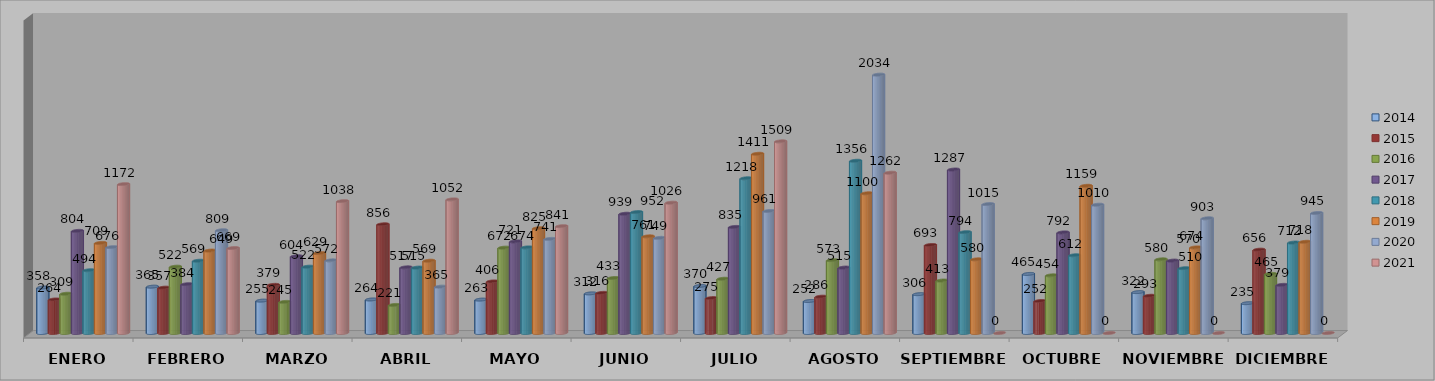
| Category | 2014 | 2015 | 2016 | 2017 | 2018 | 2019 | 2020 | 2021 |
|---|---|---|---|---|---|---|---|---|
| ENERO | 358 | 264 | 309 | 804 | 494 | 709 | 676 | 1172 |
| FEBRERO | 365 | 357 | 522 | 384 | 569 | 649 | 809 | 669 |
| MARZO | 255 | 379 | 245 | 604 | 522 | 629 | 572 | 1038 |
| ABRIL | 264 | 856 | 221 | 517 | 515 | 569 | 365 | 1052 |
| MAYO | 263 | 406 | 672 | 721 | 674 | 825 | 741 | 841 |
| JUNIO | 312 | 316 | 433 | 939 | 952 | 761 | 749 | 1026 |
| JULIO | 370 | 275 | 427 | 835 | 1218 | 1411 | 961 | 1509 |
| AGOSTO | 252 | 286 | 573 | 515 | 1356 | 1100 | 2034 | 1262 |
| SEPTIEMBRE | 306 | 693 | 413 | 1287 | 794 | 580 | 1015 | 0 |
| OCTUBRE | 465 | 252 | 454 | 792 | 612 | 1159 | 1010 | 0 |
| NOVIEMBRE | 322 | 293 | 580 | 570 | 510 | 674 | 903 | 0 |
| DICIEMBRE | 235 | 656 | 465 | 379 | 712 | 718 | 945 | 0 |